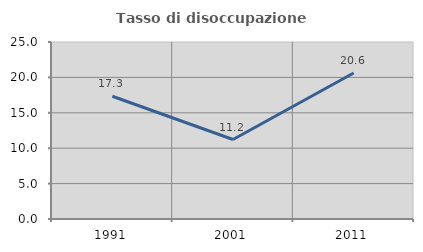
| Category | Tasso di disoccupazione giovanile  |
|---|---|
| 1991.0 | 17.337 |
| 2001.0 | 11.227 |
| 2011.0 | 20.629 |